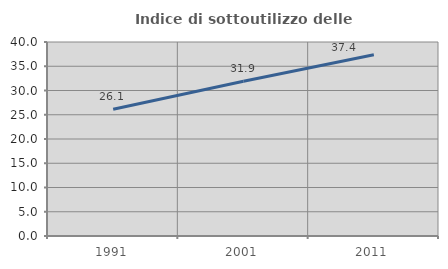
| Category | Indice di sottoutilizzo delle abitazioni  |
|---|---|
| 1991.0 | 26.144 |
| 2001.0 | 31.892 |
| 2011.0 | 37.359 |